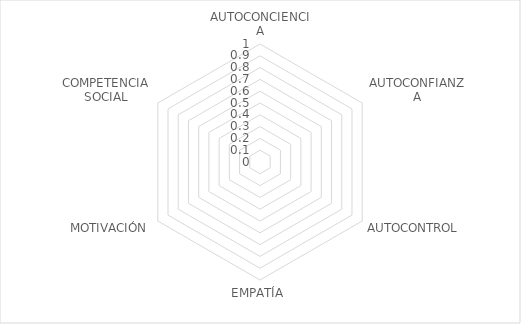
| Category | Series 0 |
|---|---|
| AUTOCONCIENCIA | 0 |
| AUTOCONFIANZA | 0 |
| AUTOCONTROL | 0 |
| EMPATÍA | 0 |
| MOTIVACIÓN | 0 |
| COMPETENCIA SOCIAL | 0 |